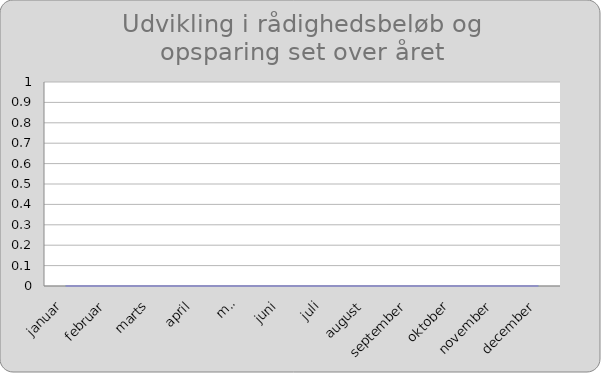
| Category | Series 0 | Series 1 |
|---|---|---|
| januar | 0 | 0 |
| februar | 0 | 0 |
| marts | 0 | 0 |
| april | 0 | 0 |
| maj | 0 | 0 |
| juni | 0 | 0 |
| juli | 0 | 0 |
| august | 0 | 0 |
| september | 0 | 0 |
| oktober | 0 | 0 |
| november | 0 | 0 |
| december | 0 | 0 |